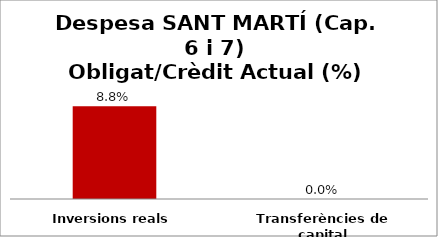
| Category | Series 0 |
|---|---|
| Inversions reals | 0.088 |
| Transferències de capital | 0 |